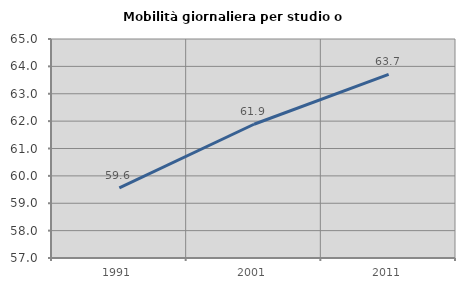
| Category | Mobilità giornaliera per studio o lavoro |
|---|---|
| 1991.0 | 59.563 |
| 2001.0 | 61.886 |
| 2011.0 | 63.708 |